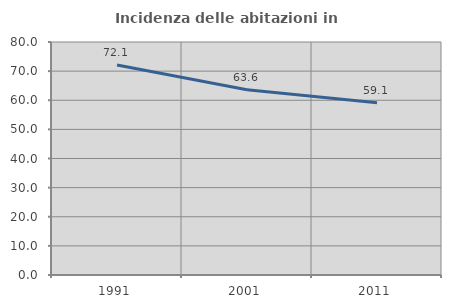
| Category | Incidenza delle abitazioni in proprietà  |
|---|---|
| 1991.0 | 72.109 |
| 2001.0 | 63.573 |
| 2011.0 | 59.142 |